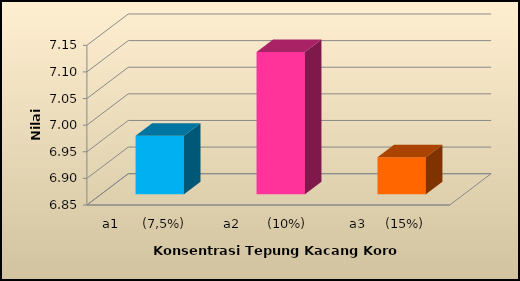
| Category | Rata-rata |
|---|---|
| a1      (7,5%) | 6.96 |
| a2       (10%) | 7.117 |
| a3     (15%) | 6.92 |